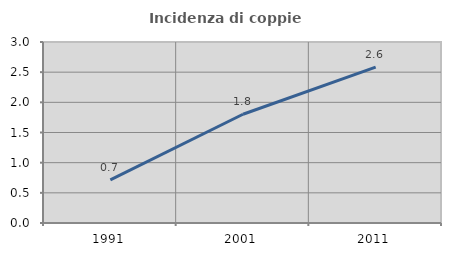
| Category | Incidenza di coppie miste |
|---|---|
| 1991.0 | 0.715 |
| 2001.0 | 1.802 |
| 2011.0 | 2.582 |